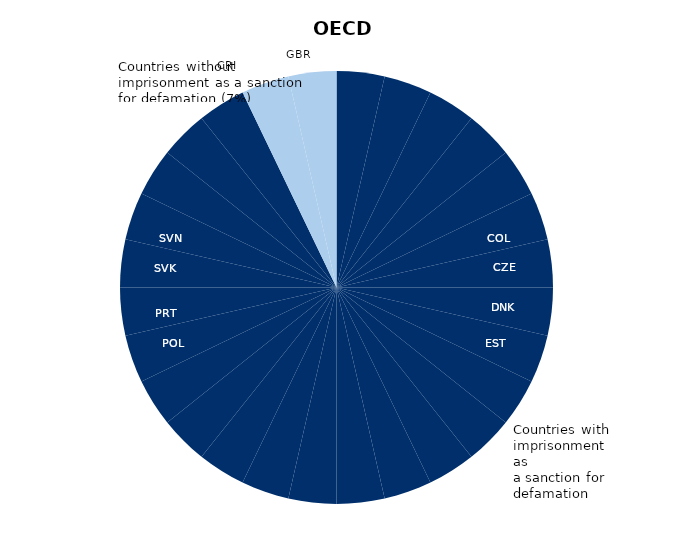
| Category | Series 0 |
|---|---|
| 0 | 1 |
| 1 | 1 |
| 2 | 1 |
| 3 | 1 |
| 4 | 1 |
| 5 | 1 |
| 6 | 1 |
| 7 | 1 |
| 8 | 1 |
| 9 | 1 |
| 10 | 1 |
| 11 | 1 |
| 12 | 1 |
| 13 | 1 |
| 14 | 1 |
| 15 | 1 |
| 16 | 1 |
| 17 | 1 |
| 18 | 1 |
| 19 | 1 |
| 20 | 1 |
| 21 | 1 |
| 22 | 1 |
| 23 | 1 |
| 24 | 1 |
| 25 | 1 |
| 26 | 1 |
| 27 | 1 |